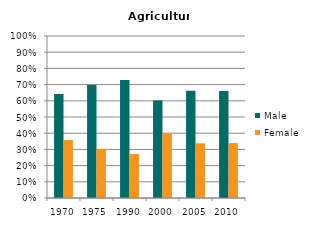
| Category | Male | Female |
|---|---|---|
| 1970.0 | 0.642 | 0.358 |
| 1975.0 | 0.697 | 0.303 |
| 1990.0 | 0.728 | 0.272 |
| 2000.0 | 0.601 | 0.399 |
| 2005.0 | 0.662 | 0.338 |
| 2010.0 | 0.66 | 0.34 |